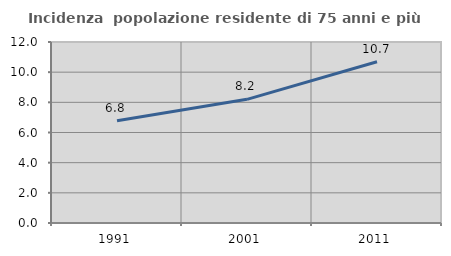
| Category | Incidenza  popolazione residente di 75 anni e più |
|---|---|
| 1991.0 | 6.782 |
| 2001.0 | 8.199 |
| 2011.0 | 10.69 |